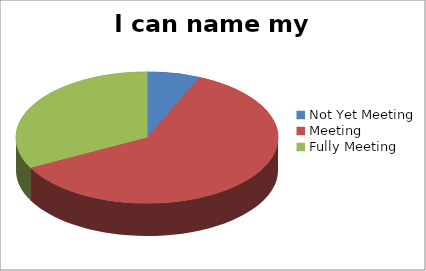
| Category | I can name my feelings |
|---|---|
| Not Yet Meeting | 3 |
| Meeting | 28 |
| Fully Meeting | 15 |